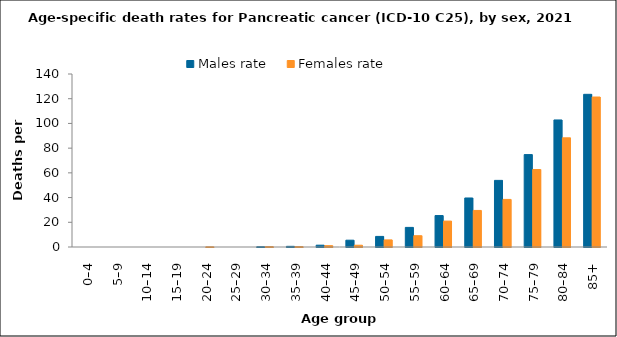
| Category | Males rate | Females rate |
|---|---|---|
| 0–4 | 0 | 0 |
| 5–9 | 0 | 0 |
| 10–14 | 0 | 0 |
| 15–19 | 0 | 0 |
| 20–24 | 0 | 0.127 |
| 25–29 | 0 | 0 |
| 30–34 | 0.213 | 0.313 |
| 35–39 | 0.539 | 0.319 |
| 40–44 | 1.471 | 1.073 |
| 45–49 | 5.506 | 1.441 |
| 50–54 | 8.563 | 5.75 |
| 55–59 | 15.868 | 9.137 |
| 60–64 | 25.45 | 20.96 |
| 65–69 | 39.674 | 29.58 |
| 70–74 | 53.904 | 38.508 |
| 75–79 | 74.773 | 62.716 |
| 80–84 | 102.816 | 88.341 |
| 85+ | 123.553 | 121.373 |